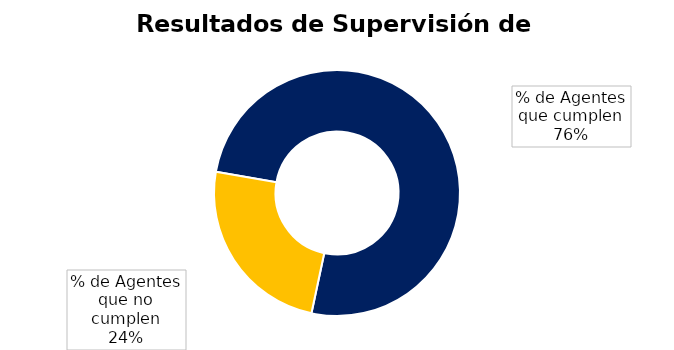
| Category | Cuenta de Departamento |
|---|---|
| % de Agentes que cumplen | 34 |
| % de Agentes que no cumplen | 11 |